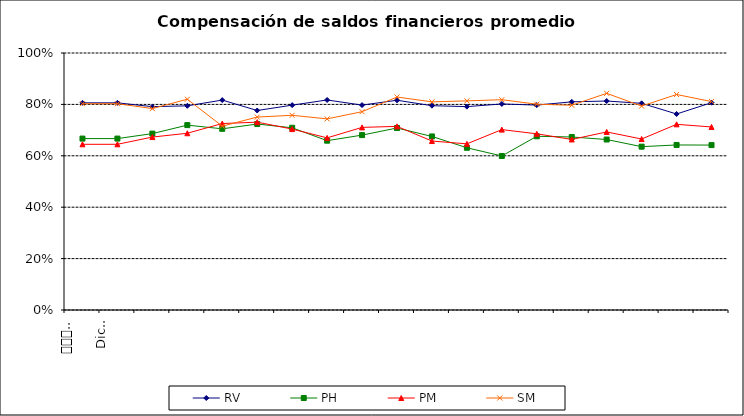
| Category | RV | PH | PM | SM |
|---|---|---|---|---|
| 0 | 0.806 | 0.667 | 0.645 | 0.803 |
| 1 | 0.806 | 0.667 | 0.645 | 0.803 |
| 2 | 0.791 | 0.686 | 0.673 | 0.784 |
| 3 | 0.794 | 0.719 | 0.688 | 0.82 |
| 4 | 0.817 | 0.705 | 0.726 | 0.715 |
| 5 | 0.776 | 0.724 | 0.731 | 0.751 |
| 6 | 0.797 | 0.709 | 0.704 | 0.758 |
| 7 | 0.817 | 0.659 | 0.67 | 0.744 |
| 8 | 0.797 | 0.681 | 0.711 | 0.772 |
| 9 | 0.816 | 0.708 | 0.715 | 0.829 |
| 10 | 0.795 | 0.675 | 0.657 | 0.81 |
| 11 | 0.791 | 0.631 | 0.646 | 0.814 |
| 12 | 0.802 | 0.599 | 0.702 | 0.818 |
| 13 | 0.797 | 0.676 | 0.686 | 0.801 |
| 14 | 0.81 | 0.673 | 0.664 | 0.797 |
| 15 | 0.813 | 0.663 | 0.693 | 0.843 |
| 16 | 0.804 | 0.636 | 0.665 | 0.794 |
| 17 | 0.763 | 0.642 | 0.722 | 0.839 |
| 18 | 0.807 | 0.642 | 0.712 | 0.811 |